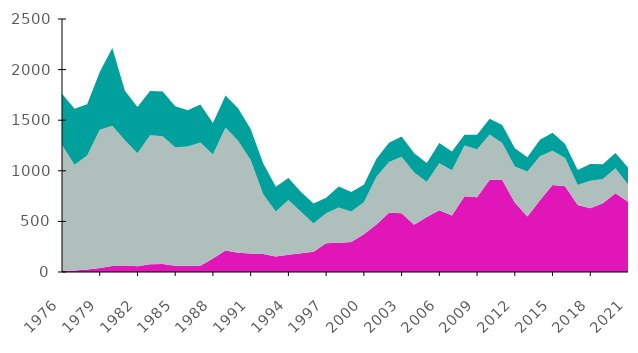
| Category | Glyfosaatti | Fenoksihapot | Muut herbisidit |
|---|---|---|---|
| 1976.0 | 9.6 | 1244.9 | 507.5 |
| 1977.0 | 15.7 | 1044.4 | 552.5 |
| 1978.0 | 25.2 | 1126.8 | 504.6 |
| 1979.0 | 39.9 | 1366.4 | 569 |
| 1980.0 | 59.4 | 1385.8 | 767.7 |
| 1981.0 | 63.1 | 1239 | 489 |
| 1982.0 | 56.9 | 1116.6 | 456.5 |
| 1983.0 | 76.2 | 1274.9 | 436.5 |
| 1984.0 | 79.4 | 1262.2 | 440.9 |
| 1985.0 | 62.2 | 1170.8 | 405.7 |
| 1986.0 | 62.3 | 1177.4 | 358 |
| 1987.0 | 60.7 | 1218.5 | 375.3 |
| 1988.0 | 133.7 | 1027.4 | 311.5 |
| 1989.0 | 212.5 | 1216 | 316.8 |
| 1990.0 | 190.3 | 1106.8 | 320.3 |
| 1991.0 | 183.6 | 923.8 | 306.1 |
| 1992.0 | 179.1 | 589.1 | 303.5 |
| 1993.0 | 153.5 | 445 | 244.3 |
| 1994.0 | 171.4 | 539.1 | 218.7 |
| 1995.0 | 184.2 | 411.3 | 195.9 |
| 1996.0 | 199 | 281.4 | 196.9 |
| 1997.0 | 284.7 | 295.8 | 153.4 |
| 1998.0 | 288.5 | 349.6 | 205.8 |
| 1999.0 | 297.2 | 300.4 | 192.6 |
| 2000.0 | 372.6 | 317.1 | 172.7 |
| 2001.0 | 468.8 | 473.5 | 177.8 |
| 2002.0 | 585.6 | 500.3 | 191.9 |
| 2003.0 | 581.1 | 558.7 | 199.6 |
| 2004.0 | 466.6 | 516.9 | 190.8 |
| 2005.0 | 543.2 | 347.5 | 186.6 |
| 2006.0 | 609.1 | 464.8 | 200.2 |
| 2007.0 | 557.4 | 447 | 186.8 |
| 2008.0 | 748.5 | 500.5 | 108.2 |
| 2009.0 | 738.8 | 473.7 | 142.6 |
| 2010.0 | 912.1 | 447.4 | 155.7 |
| 2011.0 | 908.1 | 366.4 | 177.6 |
| 2012.0 | 687.5 | 355.9 | 180.4 |
| 2013.0 | 549.5 | 442.8 | 140.6 |
| 2014.0 | 710.2 | 434.8 | 160.7 |
| 2015.0 | 859.3 | 339.8 | 177.9 |
| 2016.0 | 847.7 | 279.1 | 138.6 |
| 2017.0 | 661.2 | 197.9 | 148 |
| 2018.0 | 630.3 | 270.6 | 166.606 |
| 2019.0 | 678.4 | 239.5 | 146.4 |
| 2020.0 | 778.3 | 247.8 | 148.6 |
| 2021.0 | 695.3 | 168.7 | 167.8 |